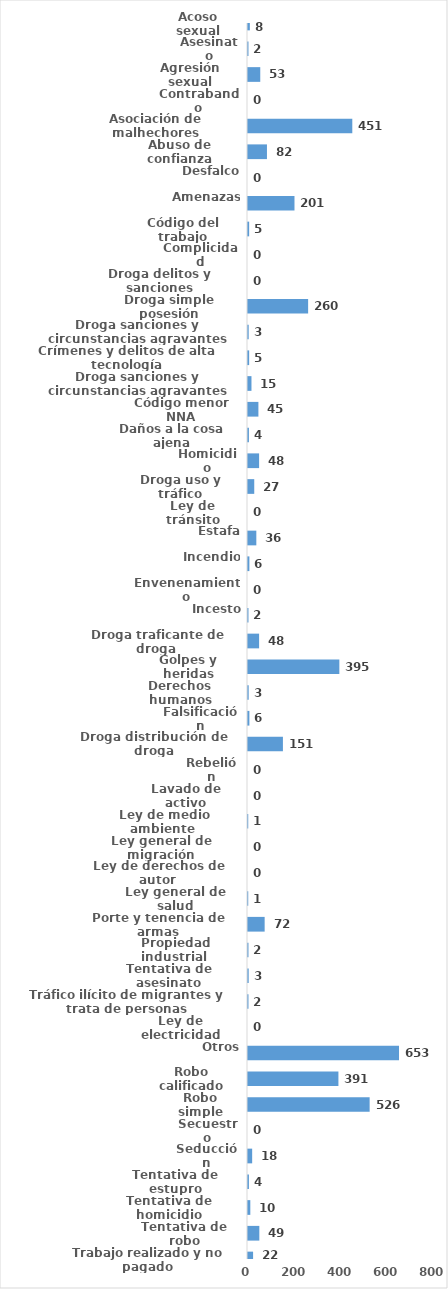
| Category | Series 0 |
|---|---|
| Acoso sexual | 8 |
| Asesinato | 2 |
| Agresión sexual | 53 |
| Contrabando | 0 |
| Asociación de malhechores | 451 |
| Abuso de confianza | 82 |
| Desfalco | 0 |
| Amenazas | 201 |
| Código del trabajo | 5 |
| Complicidad | 0 |
| Droga delitos y sanciones | 0 |
| Droga simple posesión | 260 |
| Droga sanciones y circunstancias agravantes | 3 |
| Crímenes y delitos de alta tecnología | 5 |
| Droga sanciones y circunstancias agravantes | 15 |
| Código menor NNA | 45 |
| Daños a la cosa ajena | 4 |
| Homicidio | 48 |
| Droga uso y tráfico | 27 |
| Ley de tránsito | 0 |
| Estafa | 36 |
| Incendio | 6 |
| Envenenamiento | 0 |
| Incesto | 2 |
| Droga traficante de droga  | 48 |
| Golpes y heridas | 395 |
| Derechos humanos | 3 |
| Falsificación | 6 |
| Droga distribución de droga | 151 |
| Rebelión | 0 |
| Lavado de activo | 0 |
| Ley de medio ambiente  | 1 |
| Ley general de migración | 0 |
| Ley de derechos de autor  | 0 |
| Ley general de salud | 1 |
| Porte y tenencia de armas | 72 |
| Propiedad industrial  | 2 |
| Tentativa de asesinato | 3 |
| Tráfico ilícito de migrantes y trata de personas | 2 |
| Ley de electricidad | 0 |
| Otros | 653 |
| Robo calificado | 391 |
| Robo simple | 526 |
| Secuestro | 0 |
| Seducción | 18 |
| Tentativa de estupro | 4 |
| Tentativa de homicidio | 10 |
| Tentativa de robo | 49 |
| Trabajo realizado y no pagado | 22 |